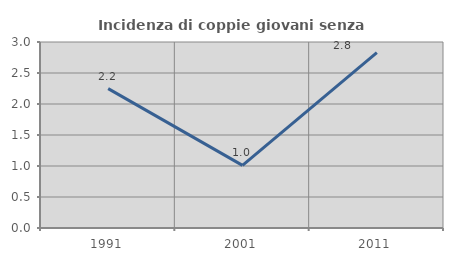
| Category | Incidenza di coppie giovani senza figli |
|---|---|
| 1991.0 | 2.247 |
| 2001.0 | 1.01 |
| 2011.0 | 2.83 |